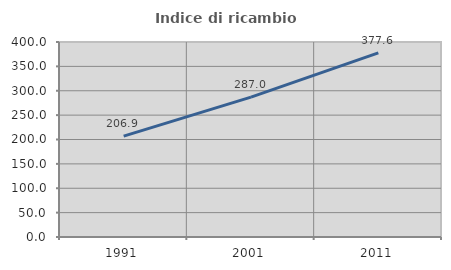
| Category | Indice di ricambio occupazionale  |
|---|---|
| 1991.0 | 206.875 |
| 2001.0 | 286.957 |
| 2011.0 | 377.612 |